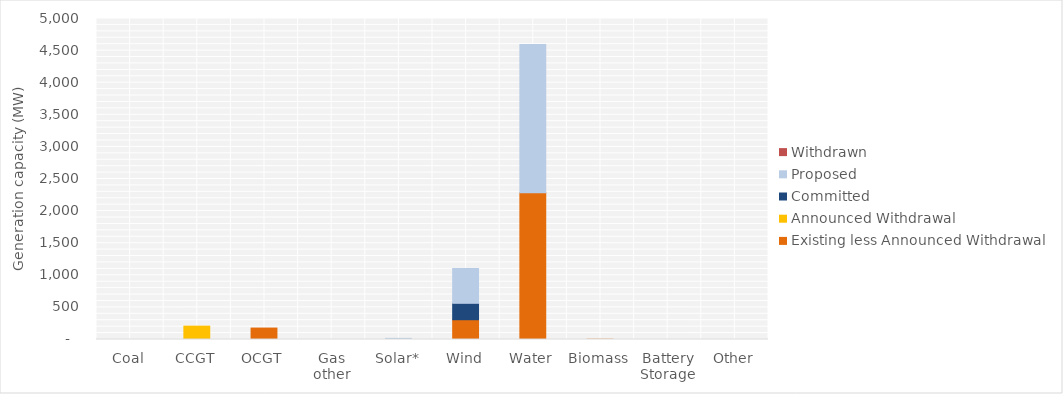
| Category | Existing less Announced Withdrawal | Announced Withdrawal | Committed | Proposed | Withdrawn |
|---|---|---|---|---|---|
| Coal | 0 | 0 | 0 | 0 | 0 |
| CCGT | 0 | 208 | 0 | 0 | 0 |
| OCGT | 178 | 0 | 0 | 0 | 0 |
| Gas other | 0 | 0 | 0 | 0 | 0 |
| Solar* | 0.265 | 0 | 0 | 17.5 | 0 |
| Wind | 308 | 0 | 255.6 | 542 | 0 |
| Water | 2286.8 | 0 | 0 | 2310 | 0 |
| Biomass | 4.936 | 0 | 0 | 0 | 0 |
| Battery Storage | 0 | 0 | 0 | 0 | 0 |
| Other | 0 | 0 | 0 | 0 | 0 |